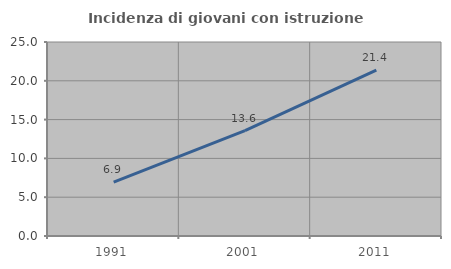
| Category | Incidenza di giovani con istruzione universitaria |
|---|---|
| 1991.0 | 6.944 |
| 2001.0 | 13.567 |
| 2011.0 | 21.387 |